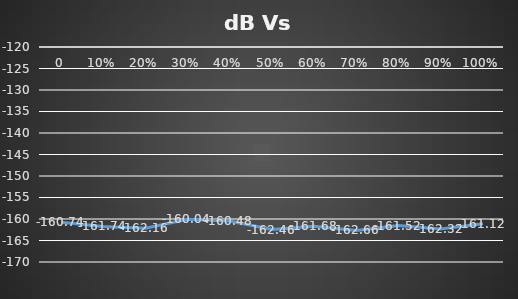
| Category | Series 0 |
|---|---|
| 0.0 | -160.74 |
| 0.1 | -161.74 |
| 0.2 | -162.16 |
| 0.3 | -160.04 |
| 0.4 | -160.48 |
| 0.5 | -162.46 |
| 0.6 | -161.68 |
| 0.7 | -162.66 |
| 0.8 | -161.52 |
| 0.9 | -162.32 |
| 1.0 | -161.12 |